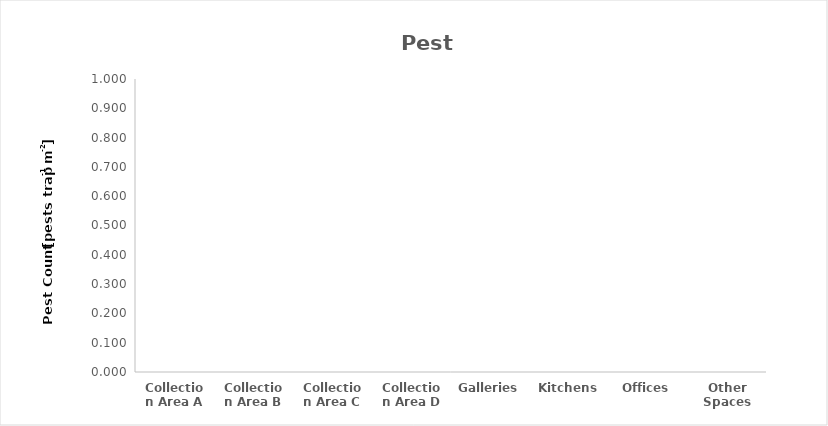
| Category | Pests at NMC |
|---|---|
| Collection Area A | 0 |
| Collection Area B | 0 |
| Collection Area C | 0 |
| Collection Area D | 0 |
| Galleries | 0 |
| Kitchens | 0 |
| Offices | 0 |
| Other Spaces | 0 |